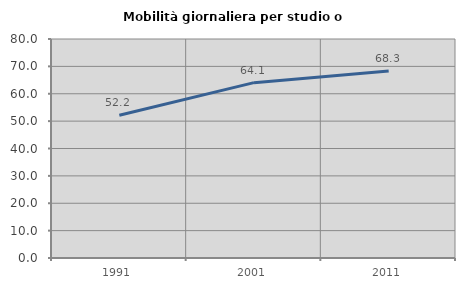
| Category | Mobilità giornaliera per studio o lavoro |
|---|---|
| 1991.0 | 52.153 |
| 2001.0 | 64.052 |
| 2011.0 | 68.293 |